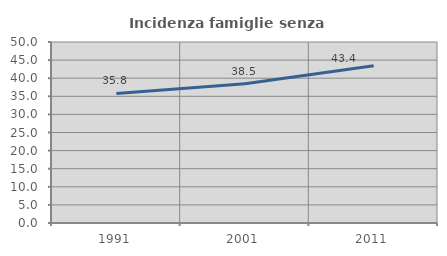
| Category | Incidenza famiglie senza nuclei |
|---|---|
| 1991.0 | 35.78 |
| 2001.0 | 38.491 |
| 2011.0 | 43.444 |